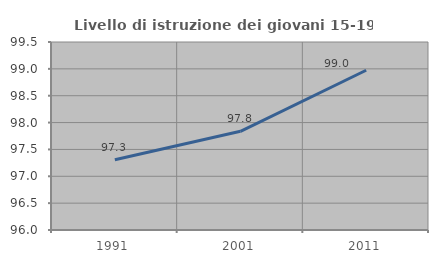
| Category | Livello di istruzione dei giovani 15-19 anni |
|---|---|
| 1991.0 | 97.308 |
| 2001.0 | 97.838 |
| 2011.0 | 98.974 |